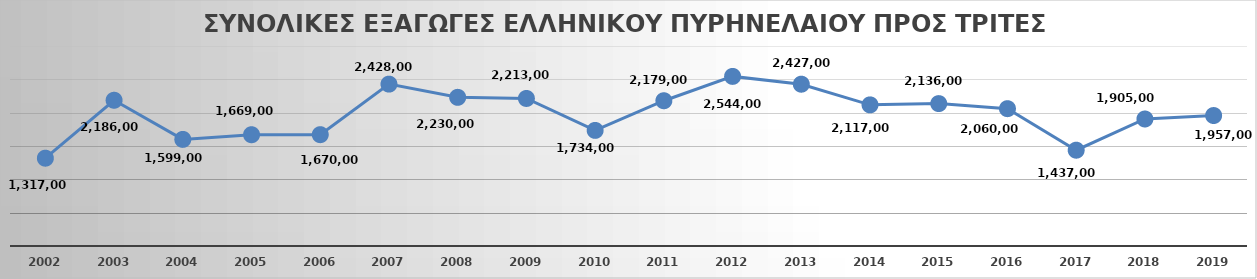
| Category | Total non-EU |
|---|---|
| 2002 | 1317000 |
| 2003 | 2186000 |
| 2004 | 1599000 |
| 2005 | 1669000 |
| 2006 | 1670000 |
| 2007 | 2428000 |
| 2008 | 2230000 |
| 2009 | 2213000 |
| 2010 | 1734000 |
| 2011 | 2179000 |
| 2012 | 2544000 |
| 2013 | 2427000 |
| 2014 | 2117000 |
| 2015 | 2136000 |
| 2016 | 2060000 |
| 2017 | 1437000 |
| 2018 | 1905000 |
| 2019 | 1957000 |